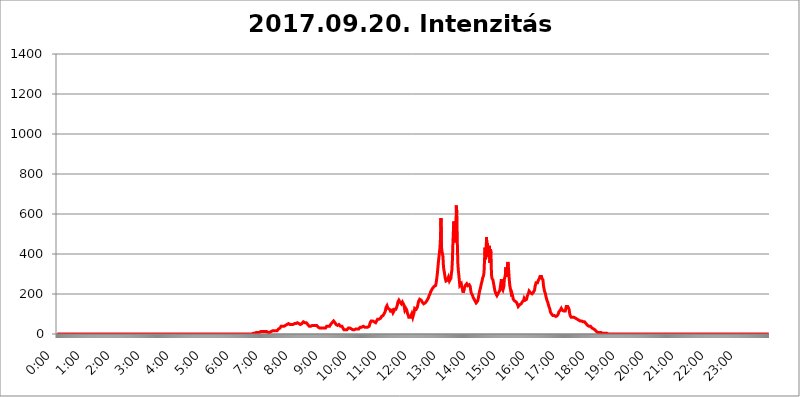
| Category | 2017.09.20. Intenzitás [W/m^2] |
|---|---|
| 0.0 | 0 |
| 0.0006944444444444445 | 0 |
| 0.001388888888888889 | 0 |
| 0.0020833333333333333 | 0 |
| 0.002777777777777778 | 0 |
| 0.003472222222222222 | 0 |
| 0.004166666666666667 | 0 |
| 0.004861111111111111 | 0 |
| 0.005555555555555556 | 0 |
| 0.0062499999999999995 | 0 |
| 0.006944444444444444 | 0 |
| 0.007638888888888889 | 0 |
| 0.008333333333333333 | 0 |
| 0.009027777777777779 | 0 |
| 0.009722222222222222 | 0 |
| 0.010416666666666666 | 0 |
| 0.011111111111111112 | 0 |
| 0.011805555555555555 | 0 |
| 0.012499999999999999 | 0 |
| 0.013194444444444444 | 0 |
| 0.013888888888888888 | 0 |
| 0.014583333333333332 | 0 |
| 0.015277777777777777 | 0 |
| 0.015972222222222224 | 0 |
| 0.016666666666666666 | 0 |
| 0.017361111111111112 | 0 |
| 0.018055555555555557 | 0 |
| 0.01875 | 0 |
| 0.019444444444444445 | 0 |
| 0.02013888888888889 | 0 |
| 0.020833333333333332 | 0 |
| 0.02152777777777778 | 0 |
| 0.022222222222222223 | 0 |
| 0.02291666666666667 | 0 |
| 0.02361111111111111 | 0 |
| 0.024305555555555556 | 0 |
| 0.024999999999999998 | 0 |
| 0.025694444444444447 | 0 |
| 0.02638888888888889 | 0 |
| 0.027083333333333334 | 0 |
| 0.027777777777777776 | 0 |
| 0.02847222222222222 | 0 |
| 0.029166666666666664 | 0 |
| 0.029861111111111113 | 0 |
| 0.030555555555555555 | 0 |
| 0.03125 | 0 |
| 0.03194444444444445 | 0 |
| 0.03263888888888889 | 0 |
| 0.03333333333333333 | 0 |
| 0.034027777777777775 | 0 |
| 0.034722222222222224 | 0 |
| 0.035416666666666666 | 0 |
| 0.036111111111111115 | 0 |
| 0.03680555555555556 | 0 |
| 0.0375 | 0 |
| 0.03819444444444444 | 0 |
| 0.03888888888888889 | 0 |
| 0.03958333333333333 | 0 |
| 0.04027777777777778 | 0 |
| 0.04097222222222222 | 0 |
| 0.041666666666666664 | 0 |
| 0.042361111111111106 | 0 |
| 0.04305555555555556 | 0 |
| 0.043750000000000004 | 0 |
| 0.044444444444444446 | 0 |
| 0.04513888888888889 | 0 |
| 0.04583333333333334 | 0 |
| 0.04652777777777778 | 0 |
| 0.04722222222222222 | 0 |
| 0.04791666666666666 | 0 |
| 0.04861111111111111 | 0 |
| 0.049305555555555554 | 0 |
| 0.049999999999999996 | 0 |
| 0.05069444444444445 | 0 |
| 0.051388888888888894 | 0 |
| 0.052083333333333336 | 0 |
| 0.05277777777777778 | 0 |
| 0.05347222222222222 | 0 |
| 0.05416666666666667 | 0 |
| 0.05486111111111111 | 0 |
| 0.05555555555555555 | 0 |
| 0.05625 | 0 |
| 0.05694444444444444 | 0 |
| 0.057638888888888885 | 0 |
| 0.05833333333333333 | 0 |
| 0.05902777777777778 | 0 |
| 0.059722222222222225 | 0 |
| 0.06041666666666667 | 0 |
| 0.061111111111111116 | 0 |
| 0.06180555555555556 | 0 |
| 0.0625 | 0 |
| 0.06319444444444444 | 0 |
| 0.06388888888888888 | 0 |
| 0.06458333333333334 | 0 |
| 0.06527777777777778 | 0 |
| 0.06597222222222222 | 0 |
| 0.06666666666666667 | 0 |
| 0.06736111111111111 | 0 |
| 0.06805555555555555 | 0 |
| 0.06874999999999999 | 0 |
| 0.06944444444444443 | 0 |
| 0.07013888888888889 | 0 |
| 0.07083333333333333 | 0 |
| 0.07152777777777779 | 0 |
| 0.07222222222222223 | 0 |
| 0.07291666666666667 | 0 |
| 0.07361111111111111 | 0 |
| 0.07430555555555556 | 0 |
| 0.075 | 0 |
| 0.07569444444444444 | 0 |
| 0.0763888888888889 | 0 |
| 0.07708333333333334 | 0 |
| 0.07777777777777778 | 0 |
| 0.07847222222222222 | 0 |
| 0.07916666666666666 | 0 |
| 0.0798611111111111 | 0 |
| 0.08055555555555556 | 0 |
| 0.08125 | 0 |
| 0.08194444444444444 | 0 |
| 0.08263888888888889 | 0 |
| 0.08333333333333333 | 0 |
| 0.08402777777777777 | 0 |
| 0.08472222222222221 | 0 |
| 0.08541666666666665 | 0 |
| 0.08611111111111112 | 0 |
| 0.08680555555555557 | 0 |
| 0.08750000000000001 | 0 |
| 0.08819444444444445 | 0 |
| 0.08888888888888889 | 0 |
| 0.08958333333333333 | 0 |
| 0.09027777777777778 | 0 |
| 0.09097222222222222 | 0 |
| 0.09166666666666667 | 0 |
| 0.09236111111111112 | 0 |
| 0.09305555555555556 | 0 |
| 0.09375 | 0 |
| 0.09444444444444444 | 0 |
| 0.09513888888888888 | 0 |
| 0.09583333333333333 | 0 |
| 0.09652777777777777 | 0 |
| 0.09722222222222222 | 0 |
| 0.09791666666666667 | 0 |
| 0.09861111111111111 | 0 |
| 0.09930555555555555 | 0 |
| 0.09999999999999999 | 0 |
| 0.10069444444444443 | 0 |
| 0.1013888888888889 | 0 |
| 0.10208333333333335 | 0 |
| 0.10277777777777779 | 0 |
| 0.10347222222222223 | 0 |
| 0.10416666666666667 | 0 |
| 0.10486111111111111 | 0 |
| 0.10555555555555556 | 0 |
| 0.10625 | 0 |
| 0.10694444444444444 | 0 |
| 0.1076388888888889 | 0 |
| 0.10833333333333334 | 0 |
| 0.10902777777777778 | 0 |
| 0.10972222222222222 | 0 |
| 0.1111111111111111 | 0 |
| 0.11180555555555556 | 0 |
| 0.11180555555555556 | 0 |
| 0.1125 | 0 |
| 0.11319444444444444 | 0 |
| 0.11388888888888889 | 0 |
| 0.11458333333333333 | 0 |
| 0.11527777777777777 | 0 |
| 0.11597222222222221 | 0 |
| 0.11666666666666665 | 0 |
| 0.1173611111111111 | 0 |
| 0.11805555555555557 | 0 |
| 0.11944444444444445 | 0 |
| 0.12013888888888889 | 0 |
| 0.12083333333333333 | 0 |
| 0.12152777777777778 | 0 |
| 0.12222222222222223 | 0 |
| 0.12291666666666667 | 0 |
| 0.12291666666666667 | 0 |
| 0.12361111111111112 | 0 |
| 0.12430555555555556 | 0 |
| 0.125 | 0 |
| 0.12569444444444444 | 0 |
| 0.12638888888888888 | 0 |
| 0.12708333333333333 | 0 |
| 0.16875 | 0 |
| 0.12847222222222224 | 0 |
| 0.12916666666666668 | 0 |
| 0.12986111111111112 | 0 |
| 0.13055555555555556 | 0 |
| 0.13125 | 0 |
| 0.13194444444444445 | 0 |
| 0.1326388888888889 | 0 |
| 0.13333333333333333 | 0 |
| 0.13402777777777777 | 0 |
| 0.13402777777777777 | 0 |
| 0.13472222222222222 | 0 |
| 0.13541666666666666 | 0 |
| 0.1361111111111111 | 0 |
| 0.13749999999999998 | 0 |
| 0.13819444444444443 | 0 |
| 0.1388888888888889 | 0 |
| 0.13958333333333334 | 0 |
| 0.14027777777777778 | 0 |
| 0.14097222222222222 | 0 |
| 0.14166666666666666 | 0 |
| 0.1423611111111111 | 0 |
| 0.14305555555555557 | 0 |
| 0.14375000000000002 | 0 |
| 0.14444444444444446 | 0 |
| 0.1451388888888889 | 0 |
| 0.1451388888888889 | 0 |
| 0.14652777777777778 | 0 |
| 0.14722222222222223 | 0 |
| 0.14791666666666667 | 0 |
| 0.1486111111111111 | 0 |
| 0.14930555555555555 | 0 |
| 0.15 | 0 |
| 0.15069444444444444 | 0 |
| 0.15138888888888888 | 0 |
| 0.15208333333333332 | 0 |
| 0.15277777777777776 | 0 |
| 0.15347222222222223 | 0 |
| 0.15416666666666667 | 0 |
| 0.15486111111111112 | 0 |
| 0.15555555555555556 | 0 |
| 0.15625 | 0 |
| 0.15694444444444444 | 0 |
| 0.15763888888888888 | 0 |
| 0.15833333333333333 | 0 |
| 0.15902777777777777 | 0 |
| 0.15972222222222224 | 0 |
| 0.16041666666666668 | 0 |
| 0.16111111111111112 | 0 |
| 0.16180555555555556 | 0 |
| 0.1625 | 0 |
| 0.16319444444444445 | 0 |
| 0.1638888888888889 | 0 |
| 0.16458333333333333 | 0 |
| 0.16527777777777777 | 0 |
| 0.16597222222222222 | 0 |
| 0.16666666666666666 | 0 |
| 0.1673611111111111 | 0 |
| 0.16805555555555554 | 0 |
| 0.16874999999999998 | 0 |
| 0.16944444444444443 | 0 |
| 0.17013888888888887 | 0 |
| 0.1708333333333333 | 0 |
| 0.17152777777777775 | 0 |
| 0.17222222222222225 | 0 |
| 0.1729166666666667 | 0 |
| 0.17361111111111113 | 0 |
| 0.17430555555555557 | 0 |
| 0.17500000000000002 | 0 |
| 0.17569444444444446 | 0 |
| 0.1763888888888889 | 0 |
| 0.17708333333333334 | 0 |
| 0.17777777777777778 | 0 |
| 0.17847222222222223 | 0 |
| 0.17916666666666667 | 0 |
| 0.1798611111111111 | 0 |
| 0.18055555555555555 | 0 |
| 0.18125 | 0 |
| 0.18194444444444444 | 0 |
| 0.1826388888888889 | 0 |
| 0.18333333333333335 | 0 |
| 0.1840277777777778 | 0 |
| 0.18472222222222223 | 0 |
| 0.18541666666666667 | 0 |
| 0.18611111111111112 | 0 |
| 0.18680555555555556 | 0 |
| 0.1875 | 0 |
| 0.18819444444444444 | 0 |
| 0.18888888888888888 | 0 |
| 0.18958333333333333 | 0 |
| 0.19027777777777777 | 0 |
| 0.1909722222222222 | 0 |
| 0.19166666666666665 | 0 |
| 0.19236111111111112 | 0 |
| 0.19305555555555554 | 0 |
| 0.19375 | 0 |
| 0.19444444444444445 | 0 |
| 0.1951388888888889 | 0 |
| 0.19583333333333333 | 0 |
| 0.19652777777777777 | 0 |
| 0.19722222222222222 | 0 |
| 0.19791666666666666 | 0 |
| 0.1986111111111111 | 0 |
| 0.19930555555555554 | 0 |
| 0.19999999999999998 | 0 |
| 0.20069444444444443 | 0 |
| 0.20138888888888887 | 0 |
| 0.2020833333333333 | 0 |
| 0.2027777777777778 | 0 |
| 0.2034722222222222 | 0 |
| 0.2041666666666667 | 0 |
| 0.20486111111111113 | 0 |
| 0.20555555555555557 | 0 |
| 0.20625000000000002 | 0 |
| 0.20694444444444446 | 0 |
| 0.2076388888888889 | 0 |
| 0.20833333333333334 | 0 |
| 0.20902777777777778 | 0 |
| 0.20972222222222223 | 0 |
| 0.21041666666666667 | 0 |
| 0.2111111111111111 | 0 |
| 0.21180555555555555 | 0 |
| 0.2125 | 0 |
| 0.21319444444444444 | 0 |
| 0.2138888888888889 | 0 |
| 0.21458333333333335 | 0 |
| 0.2152777777777778 | 0 |
| 0.21597222222222223 | 0 |
| 0.21666666666666667 | 0 |
| 0.21736111111111112 | 0 |
| 0.21805555555555556 | 0 |
| 0.21875 | 0 |
| 0.21944444444444444 | 0 |
| 0.22013888888888888 | 0 |
| 0.22083333333333333 | 0 |
| 0.22152777777777777 | 0 |
| 0.2222222222222222 | 0 |
| 0.22291666666666665 | 0 |
| 0.2236111111111111 | 0 |
| 0.22430555555555556 | 0 |
| 0.225 | 0 |
| 0.22569444444444445 | 0 |
| 0.2263888888888889 | 0 |
| 0.22708333333333333 | 0 |
| 0.22777777777777777 | 0 |
| 0.22847222222222222 | 0 |
| 0.22916666666666666 | 0 |
| 0.2298611111111111 | 0 |
| 0.23055555555555554 | 0 |
| 0.23124999999999998 | 0 |
| 0.23194444444444443 | 0 |
| 0.23263888888888887 | 0 |
| 0.2333333333333333 | 0 |
| 0.2340277777777778 | 0 |
| 0.2347222222222222 | 0 |
| 0.2354166666666667 | 0 |
| 0.23611111111111113 | 0 |
| 0.23680555555555557 | 0 |
| 0.23750000000000002 | 0 |
| 0.23819444444444446 | 0 |
| 0.2388888888888889 | 0 |
| 0.23958333333333334 | 0 |
| 0.24027777777777778 | 0 |
| 0.24097222222222223 | 0 |
| 0.24166666666666667 | 0 |
| 0.2423611111111111 | 0 |
| 0.24305555555555555 | 0 |
| 0.24375 | 0 |
| 0.24444444444444446 | 0 |
| 0.24513888888888888 | 0 |
| 0.24583333333333335 | 0 |
| 0.2465277777777778 | 0 |
| 0.24722222222222223 | 0 |
| 0.24791666666666667 | 0 |
| 0.24861111111111112 | 0 |
| 0.24930555555555556 | 0 |
| 0.25 | 0 |
| 0.25069444444444444 | 0 |
| 0.2513888888888889 | 0 |
| 0.2520833333333333 | 0 |
| 0.25277777777777777 | 0 |
| 0.2534722222222222 | 0 |
| 0.25416666666666665 | 0 |
| 0.2548611111111111 | 0 |
| 0.2555555555555556 | 0 |
| 0.25625000000000003 | 0 |
| 0.2569444444444445 | 0 |
| 0.2576388888888889 | 0 |
| 0.25833333333333336 | 0 |
| 0.2590277777777778 | 0 |
| 0.25972222222222224 | 0 |
| 0.2604166666666667 | 0 |
| 0.2611111111111111 | 0 |
| 0.26180555555555557 | 0 |
| 0.2625 | 0 |
| 0.26319444444444445 | 0 |
| 0.2638888888888889 | 0 |
| 0.26458333333333334 | 0 |
| 0.2652777777777778 | 0 |
| 0.2659722222222222 | 0 |
| 0.26666666666666666 | 0 |
| 0.2673611111111111 | 0 |
| 0.26805555555555555 | 0 |
| 0.26875 | 0 |
| 0.26944444444444443 | 0 |
| 0.2701388888888889 | 0 |
| 0.2708333333333333 | 0 |
| 0.27152777777777776 | 0 |
| 0.2722222222222222 | 0 |
| 0.27291666666666664 | 0 |
| 0.2736111111111111 | 0 |
| 0.2743055555555555 | 3.525 |
| 0.27499999999999997 | 3.525 |
| 0.27569444444444446 | 3.525 |
| 0.27638888888888885 | 3.525 |
| 0.27708333333333335 | 3.525 |
| 0.2777777777777778 | 3.525 |
| 0.27847222222222223 | 3.525 |
| 0.2791666666666667 | 7.887 |
| 0.2798611111111111 | 7.887 |
| 0.28055555555555556 | 7.887 |
| 0.28125 | 7.887 |
| 0.28194444444444444 | 7.887 |
| 0.2826388888888889 | 7.887 |
| 0.2833333333333333 | 7.887 |
| 0.28402777777777777 | 12.257 |
| 0.2847222222222222 | 12.257 |
| 0.28541666666666665 | 12.257 |
| 0.28611111111111115 | 12.257 |
| 0.28680555555555554 | 12.257 |
| 0.28750000000000003 | 12.257 |
| 0.2881944444444445 | 16.636 |
| 0.2888888888888889 | 16.636 |
| 0.28958333333333336 | 12.257 |
| 0.2902777777777778 | 12.257 |
| 0.29097222222222224 | 12.257 |
| 0.2916666666666667 | 12.257 |
| 0.2923611111111111 | 12.257 |
| 0.29305555555555557 | 12.257 |
| 0.29375 | 12.257 |
| 0.29444444444444445 | 7.887 |
| 0.2951388888888889 | 7.887 |
| 0.29583333333333334 | 7.887 |
| 0.2965277777777778 | 7.887 |
| 0.2972222222222222 | 12.257 |
| 0.29791666666666666 | 7.887 |
| 0.2986111111111111 | 12.257 |
| 0.29930555555555555 | 12.257 |
| 0.3 | 12.257 |
| 0.30069444444444443 | 12.257 |
| 0.3013888888888889 | 12.257 |
| 0.3020833333333333 | 16.636 |
| 0.30277777777777776 | 16.636 |
| 0.3034722222222222 | 16.636 |
| 0.30416666666666664 | 16.636 |
| 0.3048611111111111 | 16.636 |
| 0.3055555555555555 | 16.636 |
| 0.30624999999999997 | 16.636 |
| 0.3069444444444444 | 16.636 |
| 0.3076388888888889 | 16.636 |
| 0.30833333333333335 | 16.636 |
| 0.3090277777777778 | 21.024 |
| 0.30972222222222223 | 21.024 |
| 0.3104166666666667 | 25.419 |
| 0.3111111111111111 | 25.419 |
| 0.31180555555555556 | 29.823 |
| 0.3125 | 29.823 |
| 0.31319444444444444 | 34.234 |
| 0.3138888888888889 | 38.653 |
| 0.3145833333333333 | 38.653 |
| 0.31527777777777777 | 38.653 |
| 0.3159722222222222 | 38.653 |
| 0.31666666666666665 | 38.653 |
| 0.31736111111111115 | 38.653 |
| 0.31805555555555554 | 38.653 |
| 0.31875000000000003 | 38.653 |
| 0.3194444444444445 | 38.653 |
| 0.3201388888888889 | 43.079 |
| 0.32083333333333336 | 43.079 |
| 0.3215277777777778 | 47.511 |
| 0.32222222222222224 | 47.511 |
| 0.3229166666666667 | 51.951 |
| 0.3236111111111111 | 51.951 |
| 0.32430555555555557 | 51.951 |
| 0.325 | 51.951 |
| 0.32569444444444445 | 47.511 |
| 0.3263888888888889 | 47.511 |
| 0.32708333333333334 | 47.511 |
| 0.3277777777777778 | 43.079 |
| 0.3284722222222222 | 47.511 |
| 0.32916666666666666 | 47.511 |
| 0.3298611111111111 | 47.511 |
| 0.33055555555555555 | 47.511 |
| 0.33125 | 51.951 |
| 0.33194444444444443 | 51.951 |
| 0.3326388888888889 | 51.951 |
| 0.3333333333333333 | 51.951 |
| 0.3340277777777778 | 51.951 |
| 0.3347222222222222 | 51.951 |
| 0.3354166666666667 | 56.398 |
| 0.3361111111111111 | 56.398 |
| 0.3368055555555556 | 56.398 |
| 0.33749999999999997 | 56.398 |
| 0.33819444444444446 | 56.398 |
| 0.33888888888888885 | 51.951 |
| 0.33958333333333335 | 51.951 |
| 0.34027777777777773 | 47.511 |
| 0.34097222222222223 | 47.511 |
| 0.3416666666666666 | 47.511 |
| 0.3423611111111111 | 47.511 |
| 0.3430555555555555 | 51.951 |
| 0.34375 | 56.398 |
| 0.3444444444444445 | 56.398 |
| 0.3451388888888889 | 60.85 |
| 0.3458333333333334 | 60.85 |
| 0.34652777777777777 | 56.398 |
| 0.34722222222222227 | 56.398 |
| 0.34791666666666665 | 56.398 |
| 0.34861111111111115 | 56.398 |
| 0.34930555555555554 | 56.398 |
| 0.35000000000000003 | 56.398 |
| 0.3506944444444444 | 51.951 |
| 0.3513888888888889 | 47.511 |
| 0.3520833333333333 | 43.079 |
| 0.3527777777777778 | 43.079 |
| 0.3534722222222222 | 38.653 |
| 0.3541666666666667 | 38.653 |
| 0.3548611111111111 | 38.653 |
| 0.35555555555555557 | 38.653 |
| 0.35625 | 38.653 |
| 0.35694444444444445 | 38.653 |
| 0.3576388888888889 | 43.079 |
| 0.35833333333333334 | 43.079 |
| 0.3590277777777778 | 43.079 |
| 0.3597222222222222 | 43.079 |
| 0.36041666666666666 | 43.079 |
| 0.3611111111111111 | 43.079 |
| 0.36180555555555555 | 43.079 |
| 0.3625 | 47.511 |
| 0.36319444444444443 | 43.079 |
| 0.3638888888888889 | 43.079 |
| 0.3645833333333333 | 38.653 |
| 0.3652777777777778 | 38.653 |
| 0.3659722222222222 | 34.234 |
| 0.3666666666666667 | 34.234 |
| 0.3673611111111111 | 29.823 |
| 0.3680555555555556 | 29.823 |
| 0.36874999999999997 | 29.823 |
| 0.36944444444444446 | 29.823 |
| 0.37013888888888885 | 29.823 |
| 0.37083333333333335 | 29.823 |
| 0.37152777777777773 | 29.823 |
| 0.37222222222222223 | 29.823 |
| 0.3729166666666666 | 29.823 |
| 0.3736111111111111 | 29.823 |
| 0.3743055555555555 | 29.823 |
| 0.375 | 29.823 |
| 0.3756944444444445 | 29.823 |
| 0.3763888888888889 | 29.823 |
| 0.3770833333333334 | 34.234 |
| 0.37777777777777777 | 38.653 |
| 0.37847222222222227 | 38.653 |
| 0.37916666666666665 | 38.653 |
| 0.37986111111111115 | 38.653 |
| 0.38055555555555554 | 38.653 |
| 0.38125000000000003 | 38.653 |
| 0.3819444444444444 | 38.653 |
| 0.3826388888888889 | 43.079 |
| 0.3833333333333333 | 47.511 |
| 0.3840277777777778 | 47.511 |
| 0.3847222222222222 | 51.951 |
| 0.3854166666666667 | 56.398 |
| 0.3861111111111111 | 56.398 |
| 0.38680555555555557 | 60.85 |
| 0.3875 | 65.31 |
| 0.38819444444444445 | 65.31 |
| 0.3888888888888889 | 65.31 |
| 0.38958333333333334 | 56.398 |
| 0.3902777777777778 | 51.951 |
| 0.3909722222222222 | 47.511 |
| 0.39166666666666666 | 43.079 |
| 0.3923611111111111 | 43.079 |
| 0.39305555555555555 | 43.079 |
| 0.39375 | 43.079 |
| 0.39444444444444443 | 43.079 |
| 0.3951388888888889 | 47.511 |
| 0.3958333333333333 | 47.511 |
| 0.3965277777777778 | 43.079 |
| 0.3972222222222222 | 38.653 |
| 0.3979166666666667 | 38.653 |
| 0.3986111111111111 | 38.653 |
| 0.3993055555555556 | 38.653 |
| 0.39999999999999997 | 34.234 |
| 0.40069444444444446 | 29.823 |
| 0.40138888888888885 | 25.419 |
| 0.40208333333333335 | 21.024 |
| 0.40277777777777773 | 21.024 |
| 0.40347222222222223 | 21.024 |
| 0.4041666666666666 | 21.024 |
| 0.4048611111111111 | 21.024 |
| 0.4055555555555555 | 21.024 |
| 0.40625 | 21.024 |
| 0.4069444444444445 | 21.024 |
| 0.4076388888888889 | 25.419 |
| 0.4083333333333334 | 29.823 |
| 0.40902777777777777 | 29.823 |
| 0.40972222222222227 | 29.823 |
| 0.41041666666666665 | 29.823 |
| 0.41111111111111115 | 29.823 |
| 0.41180555555555554 | 29.823 |
| 0.41250000000000003 | 25.419 |
| 0.4131944444444444 | 25.419 |
| 0.4138888888888889 | 21.024 |
| 0.4145833333333333 | 21.024 |
| 0.4152777777777778 | 21.024 |
| 0.4159722222222222 | 21.024 |
| 0.4166666666666667 | 21.024 |
| 0.4173611111111111 | 21.024 |
| 0.41805555555555557 | 25.419 |
| 0.41875 | 25.419 |
| 0.41944444444444445 | 29.823 |
| 0.4201388888888889 | 29.823 |
| 0.42083333333333334 | 25.419 |
| 0.4215277777777778 | 25.419 |
| 0.4222222222222222 | 25.419 |
| 0.42291666666666666 | 25.419 |
| 0.4236111111111111 | 29.823 |
| 0.42430555555555555 | 29.823 |
| 0.425 | 34.234 |
| 0.42569444444444443 | 34.234 |
| 0.4263888888888889 | 34.234 |
| 0.4270833333333333 | 34.234 |
| 0.4277777777777778 | 34.234 |
| 0.4284722222222222 | 34.234 |
| 0.4291666666666667 | 38.653 |
| 0.4298611111111111 | 34.234 |
| 0.4305555555555556 | 34.234 |
| 0.43124999999999997 | 34.234 |
| 0.43194444444444446 | 34.234 |
| 0.43263888888888885 | 34.234 |
| 0.43333333333333335 | 34.234 |
| 0.43402777777777773 | 34.234 |
| 0.43472222222222223 | 34.234 |
| 0.4354166666666666 | 34.234 |
| 0.4361111111111111 | 34.234 |
| 0.4368055555555555 | 38.653 |
| 0.4375 | 38.653 |
| 0.4381944444444445 | 47.511 |
| 0.4388888888888889 | 56.398 |
| 0.4395833333333334 | 60.85 |
| 0.44027777777777777 | 65.31 |
| 0.44097222222222227 | 65.31 |
| 0.44166666666666665 | 65.31 |
| 0.44236111111111115 | 65.31 |
| 0.44305555555555554 | 65.31 |
| 0.44375000000000003 | 65.31 |
| 0.4444444444444444 | 60.85 |
| 0.4451388888888889 | 56.398 |
| 0.4458333333333333 | 56.398 |
| 0.4465277777777778 | 56.398 |
| 0.4472222222222222 | 60.85 |
| 0.4479166666666667 | 65.31 |
| 0.4486111111111111 | 69.775 |
| 0.44930555555555557 | 74.246 |
| 0.45 | 74.246 |
| 0.45069444444444445 | 74.246 |
| 0.4513888888888889 | 74.246 |
| 0.45208333333333334 | 74.246 |
| 0.4527777777777778 | 74.246 |
| 0.4534722222222222 | 78.722 |
| 0.45416666666666666 | 83.205 |
| 0.4548611111111111 | 87.692 |
| 0.45555555555555555 | 87.692 |
| 0.45625 | 87.692 |
| 0.45694444444444443 | 92.184 |
| 0.4576388888888889 | 96.682 |
| 0.4583333333333333 | 101.184 |
| 0.4590277777777778 | 105.69 |
| 0.4597222222222222 | 110.201 |
| 0.4604166666666667 | 119.235 |
| 0.4611111111111111 | 132.814 |
| 0.4618055555555556 | 137.347 |
| 0.46249999999999997 | 141.884 |
| 0.46319444444444446 | 137.347 |
| 0.46388888888888885 | 128.284 |
| 0.46458333333333335 | 128.284 |
| 0.46527777777777773 | 128.284 |
| 0.46597222222222223 | 123.758 |
| 0.4666666666666666 | 119.235 |
| 0.4673611111111111 | 114.716 |
| 0.4680555555555555 | 119.235 |
| 0.46875 | 119.235 |
| 0.4694444444444445 | 119.235 |
| 0.4701388888888889 | 114.716 |
| 0.4708333333333334 | 105.69 |
| 0.47152777777777777 | 110.201 |
| 0.47222222222222227 | 114.716 |
| 0.47291666666666665 | 123.758 |
| 0.47361111111111115 | 128.284 |
| 0.47430555555555554 | 128.284 |
| 0.47500000000000003 | 123.758 |
| 0.4756944444444444 | 128.284 |
| 0.4763888888888889 | 137.347 |
| 0.4770833333333333 | 146.423 |
| 0.4777777777777778 | 160.056 |
| 0.4784722222222222 | 164.605 |
| 0.4791666666666667 | 169.156 |
| 0.4798611111111111 | 164.605 |
| 0.48055555555555557 | 160.056 |
| 0.48125 | 155.509 |
| 0.48194444444444445 | 155.509 |
| 0.4826388888888889 | 150.964 |
| 0.48333333333333334 | 155.509 |
| 0.4840277777777778 | 160.056 |
| 0.4847222222222222 | 160.056 |
| 0.48541666666666666 | 155.509 |
| 0.4861111111111111 | 146.423 |
| 0.48680555555555555 | 132.814 |
| 0.4875 | 119.235 |
| 0.48819444444444443 | 119.235 |
| 0.4888888888888889 | 128.284 |
| 0.4895833333333333 | 128.284 |
| 0.4902777777777778 | 119.235 |
| 0.4909722222222222 | 105.69 |
| 0.4916666666666667 | 101.184 |
| 0.4923611111111111 | 92.184 |
| 0.4930555555555556 | 83.205 |
| 0.49374999999999997 | 87.692 |
| 0.49444444444444446 | 87.692 |
| 0.49513888888888885 | 83.205 |
| 0.49583333333333335 | 83.205 |
| 0.49652777777777773 | 87.692 |
| 0.49722222222222223 | 101.184 |
| 0.4979166666666666 | 101.184 |
| 0.4986111111111111 | 83.205 |
| 0.4993055555555555 | 78.722 |
| 0.5 | 87.692 |
| 0.5006944444444444 | 110.201 |
| 0.5013888888888889 | 128.284 |
| 0.5020833333333333 | 128.284 |
| 0.5027777777777778 | 123.758 |
| 0.5034722222222222 | 123.758 |
| 0.5041666666666667 | 128.284 |
| 0.5048611111111111 | 132.814 |
| 0.5055555555555555 | 141.884 |
| 0.50625 | 155.509 |
| 0.5069444444444444 | 164.605 |
| 0.5076388888888889 | 169.156 |
| 0.5083333333333333 | 173.709 |
| 0.5090277777777777 | 173.709 |
| 0.5097222222222222 | 173.709 |
| 0.5104166666666666 | 169.156 |
| 0.5111111111111112 | 164.605 |
| 0.5118055555555555 | 160.056 |
| 0.5125000000000001 | 155.509 |
| 0.5131944444444444 | 155.509 |
| 0.513888888888889 | 150.964 |
| 0.5145833333333333 | 150.964 |
| 0.5152777777777778 | 155.509 |
| 0.5159722222222222 | 155.509 |
| 0.5166666666666667 | 160.056 |
| 0.517361111111111 | 160.056 |
| 0.5180555555555556 | 164.605 |
| 0.5187499999999999 | 164.605 |
| 0.5194444444444445 | 173.709 |
| 0.5201388888888888 | 173.709 |
| 0.5208333333333334 | 182.82 |
| 0.5215277777777778 | 191.937 |
| 0.5222222222222223 | 196.497 |
| 0.5229166666666667 | 201.058 |
| 0.5236111111111111 | 210.182 |
| 0.5243055555555556 | 214.746 |
| 0.525 | 219.309 |
| 0.5256944444444445 | 223.873 |
| 0.5263888888888889 | 228.436 |
| 0.5270833333333333 | 233 |
| 0.5277777777777778 | 233 |
| 0.5284722222222222 | 237.564 |
| 0.5291666666666667 | 237.564 |
| 0.5298611111111111 | 242.127 |
| 0.5305555555555556 | 242.127 |
| 0.53125 | 251.251 |
| 0.5319444444444444 | 269.49 |
| 0.5326388888888889 | 287.709 |
| 0.5333333333333333 | 310.44 |
| 0.5340277777777778 | 337.639 |
| 0.5347222222222222 | 364.728 |
| 0.5354166666666667 | 387.202 |
| 0.5361111111111111 | 409.574 |
| 0.5368055555555555 | 431.833 |
| 0.5375 | 480.356 |
| 0.5381944444444444 | 579.542 |
| 0.5388888888888889 | 431.833 |
| 0.5395833333333333 | 414.035 |
| 0.5402777777777777 | 409.574 |
| 0.5409722222222222 | 387.202 |
| 0.5416666666666666 | 337.639 |
| 0.5423611111111112 | 319.517 |
| 0.5430555555555555 | 305.898 |
| 0.5437500000000001 | 287.709 |
| 0.5444444444444444 | 274.047 |
| 0.545138888888889 | 264.932 |
| 0.5458333333333333 | 260.373 |
| 0.5465277777777778 | 264.932 |
| 0.5472222222222222 | 269.49 |
| 0.5479166666666667 | 274.047 |
| 0.548611111111111 | 283.156 |
| 0.5493055555555556 | 274.047 |
| 0.5499999999999999 | 264.932 |
| 0.5506944444444445 | 260.373 |
| 0.5513888888888888 | 260.373 |
| 0.5520833333333334 | 278.603 |
| 0.5527777777777778 | 301.354 |
| 0.5534722222222223 | 319.517 |
| 0.5541666666666667 | 364.728 |
| 0.5548611111111111 | 445.129 |
| 0.5555555555555556 | 510.885 |
| 0.55625 | 562.53 |
| 0.5569444444444445 | 506.542 |
| 0.5576388888888889 | 458.38 |
| 0.5583333333333333 | 471.582 |
| 0.5590277777777778 | 506.542 |
| 0.5597222222222222 | 642.4 |
| 0.5604166666666667 | 604.864 |
| 0.5611111111111111 | 458.38 |
| 0.5618055555555556 | 355.712 |
| 0.5625 | 319.517 |
| 0.5631944444444444 | 296.808 |
| 0.5638888888888889 | 269.49 |
| 0.5645833333333333 | 242.127 |
| 0.5652777777777778 | 237.564 |
| 0.5659722222222222 | 246.689 |
| 0.5666666666666667 | 251.251 |
| 0.5673611111111111 | 237.564 |
| 0.5680555555555555 | 228.436 |
| 0.56875 | 214.746 |
| 0.5694444444444444 | 205.62 |
| 0.5701388888888889 | 210.182 |
| 0.5708333333333333 | 228.436 |
| 0.5715277777777777 | 233 |
| 0.5722222222222222 | 242.127 |
| 0.5729166666666666 | 242.127 |
| 0.5736111111111112 | 242.127 |
| 0.5743055555555555 | 251.251 |
| 0.5750000000000001 | 246.689 |
| 0.5756944444444444 | 242.127 |
| 0.576388888888889 | 242.127 |
| 0.5770833333333333 | 242.127 |
| 0.5777777777777778 | 246.689 |
| 0.5784722222222222 | 251.251 |
| 0.5791666666666667 | 237.564 |
| 0.579861111111111 | 219.309 |
| 0.5805555555555556 | 205.62 |
| 0.5812499999999999 | 201.058 |
| 0.5819444444444445 | 201.058 |
| 0.5826388888888888 | 191.937 |
| 0.5833333333333334 | 182.82 |
| 0.5840277777777778 | 178.264 |
| 0.5847222222222223 | 173.709 |
| 0.5854166666666667 | 169.156 |
| 0.5861111111111111 | 164.605 |
| 0.5868055555555556 | 160.056 |
| 0.5875 | 155.509 |
| 0.5881944444444445 | 155.509 |
| 0.5888888888888889 | 155.509 |
| 0.5895833333333333 | 164.605 |
| 0.5902777777777778 | 173.709 |
| 0.5909722222222222 | 187.378 |
| 0.5916666666666667 | 201.058 |
| 0.5923611111111111 | 214.746 |
| 0.5930555555555556 | 214.746 |
| 0.59375 | 233 |
| 0.5944444444444444 | 246.689 |
| 0.5951388888888889 | 255.813 |
| 0.5958333333333333 | 264.932 |
| 0.5965277777777778 | 278.603 |
| 0.5972222222222222 | 283.156 |
| 0.5979166666666667 | 292.259 |
| 0.5986111111111111 | 310.44 |
| 0.5993055555555555 | 373.729 |
| 0.6 | 431.833 |
| 0.6006944444444444 | 373.729 |
| 0.6013888888888889 | 396.164 |
| 0.6020833333333333 | 484.735 |
| 0.6027777777777777 | 405.108 |
| 0.6034722222222222 | 453.968 |
| 0.6041666666666666 | 387.202 |
| 0.6048611111111112 | 382.715 |
| 0.6055555555555555 | 409.574 |
| 0.6062500000000001 | 440.702 |
| 0.6069444444444444 | 355.712 |
| 0.607638888888889 | 422.943 |
| 0.6083333333333333 | 405.108 |
| 0.6090277777777778 | 296.808 |
| 0.6097222222222222 | 278.603 |
| 0.6104166666666667 | 278.603 |
| 0.611111111111111 | 269.49 |
| 0.6118055555555556 | 255.813 |
| 0.6124999999999999 | 242.127 |
| 0.6131944444444445 | 228.436 |
| 0.6138888888888888 | 214.746 |
| 0.6145833333333334 | 210.182 |
| 0.6152777777777778 | 201.058 |
| 0.6159722222222223 | 196.497 |
| 0.6166666666666667 | 191.937 |
| 0.6173611111111111 | 191.937 |
| 0.6180555555555556 | 201.058 |
| 0.61875 | 205.62 |
| 0.6194444444444445 | 210.182 |
| 0.6201388888888889 | 214.746 |
| 0.6208333333333333 | 219.309 |
| 0.6215277777777778 | 219.309 |
| 0.6222222222222222 | 219.309 |
| 0.6229166666666667 | 274.047 |
| 0.6236111111111111 | 228.436 |
| 0.6243055555555556 | 228.436 |
| 0.625 | 219.309 |
| 0.6256944444444444 | 223.873 |
| 0.6263888888888889 | 237.564 |
| 0.6270833333333333 | 274.047 |
| 0.6277777777777778 | 283.156 |
| 0.6284722222222222 | 296.808 |
| 0.6291666666666667 | 333.113 |
| 0.6298611111111111 | 287.709 |
| 0.6305555555555555 | 301.354 |
| 0.63125 | 305.898 |
| 0.6319444444444444 | 360.221 |
| 0.6326388888888889 | 342.162 |
| 0.6333333333333333 | 305.898 |
| 0.6340277777777777 | 269.49 |
| 0.6347222222222222 | 242.127 |
| 0.6354166666666666 | 228.436 |
| 0.6361111111111112 | 214.746 |
| 0.6368055555555555 | 201.058 |
| 0.6375000000000001 | 187.378 |
| 0.6381944444444444 | 196.497 |
| 0.638888888888889 | 187.378 |
| 0.6395833333333333 | 173.709 |
| 0.6402777777777778 | 173.709 |
| 0.6409722222222222 | 173.709 |
| 0.6416666666666667 | 164.605 |
| 0.642361111111111 | 169.156 |
| 0.6430555555555556 | 164.605 |
| 0.6437499999999999 | 160.056 |
| 0.6444444444444445 | 155.509 |
| 0.6451388888888888 | 150.964 |
| 0.6458333333333334 | 146.423 |
| 0.6465277777777778 | 137.347 |
| 0.6472222222222223 | 137.347 |
| 0.6479166666666667 | 141.884 |
| 0.6486111111111111 | 146.423 |
| 0.6493055555555556 | 150.964 |
| 0.65 | 150.964 |
| 0.6506944444444445 | 150.964 |
| 0.6513888888888889 | 155.509 |
| 0.6520833333333333 | 160.056 |
| 0.6527777777777778 | 160.056 |
| 0.6534722222222222 | 164.605 |
| 0.6541666666666667 | 169.156 |
| 0.6548611111111111 | 178.264 |
| 0.6555555555555556 | 178.264 |
| 0.65625 | 169.156 |
| 0.6569444444444444 | 164.605 |
| 0.6576388888888889 | 169.156 |
| 0.6583333333333333 | 173.709 |
| 0.6590277777777778 | 187.378 |
| 0.6597222222222222 | 182.82 |
| 0.6604166666666667 | 187.378 |
| 0.6611111111111111 | 205.62 |
| 0.6618055555555555 | 214.746 |
| 0.6625 | 214.746 |
| 0.6631944444444444 | 210.182 |
| 0.6638888888888889 | 205.62 |
| 0.6645833333333333 | 201.058 |
| 0.6652777777777777 | 201.058 |
| 0.6659722222222222 | 201.058 |
| 0.6666666666666666 | 201.058 |
| 0.6673611111111111 | 205.62 |
| 0.6680555555555556 | 210.182 |
| 0.6687500000000001 | 214.746 |
| 0.6694444444444444 | 219.309 |
| 0.6701388888888888 | 237.564 |
| 0.6708333333333334 | 233 |
| 0.6715277777777778 | 255.813 |
| 0.6722222222222222 | 255.813 |
| 0.6729166666666666 | 255.813 |
| 0.6736111111111112 | 255.813 |
| 0.6743055555555556 | 264.932 |
| 0.6749999999999999 | 269.49 |
| 0.6756944444444444 | 274.047 |
| 0.6763888888888889 | 278.603 |
| 0.6770833333333334 | 287.709 |
| 0.6777777777777777 | 287.709 |
| 0.6784722222222223 | 287.709 |
| 0.6791666666666667 | 287.709 |
| 0.6798611111111111 | 278.603 |
| 0.6805555555555555 | 278.603 |
| 0.68125 | 269.49 |
| 0.6819444444444445 | 242.127 |
| 0.6826388888888889 | 228.436 |
| 0.6833333333333332 | 214.746 |
| 0.6840277777777778 | 210.182 |
| 0.6847222222222222 | 201.058 |
| 0.6854166666666667 | 187.378 |
| 0.686111111111111 | 182.82 |
| 0.6868055555555556 | 169.156 |
| 0.6875 | 164.605 |
| 0.6881944444444444 | 155.509 |
| 0.688888888888889 | 146.423 |
| 0.6895833333333333 | 137.347 |
| 0.6902777777777778 | 132.814 |
| 0.6909722222222222 | 123.758 |
| 0.6916666666666668 | 110.201 |
| 0.6923611111111111 | 105.69 |
| 0.6930555555555555 | 101.184 |
| 0.69375 | 96.682 |
| 0.6944444444444445 | 96.682 |
| 0.6951388888888889 | 92.184 |
| 0.6958333333333333 | 92.184 |
| 0.6965277777777777 | 92.184 |
| 0.6972222222222223 | 92.184 |
| 0.6979166666666666 | 87.692 |
| 0.6986111111111111 | 87.692 |
| 0.6993055555555556 | 87.692 |
| 0.7000000000000001 | 87.692 |
| 0.7006944444444444 | 87.692 |
| 0.7013888888888888 | 92.184 |
| 0.7020833333333334 | 96.682 |
| 0.7027777777777778 | 101.184 |
| 0.7034722222222222 | 110.201 |
| 0.7041666666666666 | 110.201 |
| 0.7048611111111112 | 114.716 |
| 0.7055555555555556 | 119.235 |
| 0.7062499999999999 | 123.758 |
| 0.7069444444444444 | 128.284 |
| 0.7076388888888889 | 128.284 |
| 0.7083333333333334 | 119.235 |
| 0.7090277777777777 | 119.235 |
| 0.7097222222222223 | 114.716 |
| 0.7104166666666667 | 114.716 |
| 0.7111111111111111 | 114.716 |
| 0.7118055555555555 | 110.201 |
| 0.7125 | 114.716 |
| 0.7131944444444445 | 119.235 |
| 0.7138888888888889 | 137.347 |
| 0.7145833333333332 | 137.347 |
| 0.7152777777777778 | 137.347 |
| 0.7159722222222222 | 137.347 |
| 0.7166666666666667 | 132.814 |
| 0.717361111111111 | 128.284 |
| 0.7180555555555556 | 119.235 |
| 0.71875 | 101.184 |
| 0.7194444444444444 | 92.184 |
| 0.720138888888889 | 92.184 |
| 0.7208333333333333 | 83.205 |
| 0.7215277777777778 | 83.205 |
| 0.7222222222222222 | 78.722 |
| 0.7229166666666668 | 83.205 |
| 0.7236111111111111 | 83.205 |
| 0.7243055555555555 | 83.205 |
| 0.725 | 83.205 |
| 0.7256944444444445 | 83.205 |
| 0.7263888888888889 | 83.205 |
| 0.7270833333333333 | 78.722 |
| 0.7277777777777777 | 78.722 |
| 0.7284722222222223 | 78.722 |
| 0.7291666666666666 | 74.246 |
| 0.7298611111111111 | 74.246 |
| 0.7305555555555556 | 74.246 |
| 0.7312500000000001 | 69.775 |
| 0.7319444444444444 | 69.775 |
| 0.7326388888888888 | 69.775 |
| 0.7333333333333334 | 65.31 |
| 0.7340277777777778 | 65.31 |
| 0.7347222222222222 | 65.31 |
| 0.7354166666666666 | 65.31 |
| 0.7361111111111112 | 65.31 |
| 0.7368055555555556 | 60.85 |
| 0.7374999999999999 | 60.85 |
| 0.7381944444444444 | 60.85 |
| 0.7388888888888889 | 60.85 |
| 0.7395833333333334 | 60.85 |
| 0.7402777777777777 | 56.398 |
| 0.7409722222222223 | 56.398 |
| 0.7416666666666667 | 51.951 |
| 0.7423611111111111 | 47.511 |
| 0.7430555555555555 | 47.511 |
| 0.74375 | 43.079 |
| 0.7444444444444445 | 43.079 |
| 0.7451388888888889 | 43.079 |
| 0.7458333333333332 | 38.653 |
| 0.7465277777777778 | 38.653 |
| 0.7472222222222222 | 38.653 |
| 0.7479166666666667 | 38.653 |
| 0.748611111111111 | 34.234 |
| 0.7493055555555556 | 34.234 |
| 0.75 | 29.823 |
| 0.7506944444444444 | 29.823 |
| 0.751388888888889 | 29.823 |
| 0.7520833333333333 | 25.419 |
| 0.7527777777777778 | 25.419 |
| 0.7534722222222222 | 21.024 |
| 0.7541666666666668 | 21.024 |
| 0.7548611111111111 | 16.636 |
| 0.7555555555555555 | 16.636 |
| 0.75625 | 12.257 |
| 0.7569444444444445 | 12.257 |
| 0.7576388888888889 | 12.257 |
| 0.7583333333333333 | 7.887 |
| 0.7590277777777777 | 7.887 |
| 0.7597222222222223 | 7.887 |
| 0.7604166666666666 | 7.887 |
| 0.7611111111111111 | 7.887 |
| 0.7618055555555556 | 7.887 |
| 0.7625000000000001 | 7.887 |
| 0.7631944444444444 | 3.525 |
| 0.7638888888888888 | 3.525 |
| 0.7645833333333334 | 3.525 |
| 0.7652777777777778 | 3.525 |
| 0.7659722222222222 | 3.525 |
| 0.7666666666666666 | 3.525 |
| 0.7673611111111112 | 3.525 |
| 0.7680555555555556 | 3.525 |
| 0.7687499999999999 | 3.525 |
| 0.7694444444444444 | 3.525 |
| 0.7701388888888889 | 3.525 |
| 0.7708333333333334 | 3.525 |
| 0.7715277777777777 | 3.525 |
| 0.7722222222222223 | 0 |
| 0.7729166666666667 | 0 |
| 0.7736111111111111 | 0 |
| 0.7743055555555555 | 0 |
| 0.775 | 0 |
| 0.7756944444444445 | 0 |
| 0.7763888888888889 | 0 |
| 0.7770833333333332 | 0 |
| 0.7777777777777778 | 0 |
| 0.7784722222222222 | 0 |
| 0.7791666666666667 | 0 |
| 0.779861111111111 | 0 |
| 0.7805555555555556 | 0 |
| 0.78125 | 0 |
| 0.7819444444444444 | 0 |
| 0.782638888888889 | 0 |
| 0.7833333333333333 | 0 |
| 0.7840277777777778 | 0 |
| 0.7847222222222222 | 0 |
| 0.7854166666666668 | 0 |
| 0.7861111111111111 | 0 |
| 0.7868055555555555 | 0 |
| 0.7875 | 0 |
| 0.7881944444444445 | 0 |
| 0.7888888888888889 | 0 |
| 0.7895833333333333 | 0 |
| 0.7902777777777777 | 0 |
| 0.7909722222222223 | 0 |
| 0.7916666666666666 | 0 |
| 0.7923611111111111 | 0 |
| 0.7930555555555556 | 0 |
| 0.7937500000000001 | 0 |
| 0.7944444444444444 | 0 |
| 0.7951388888888888 | 0 |
| 0.7958333333333334 | 0 |
| 0.7965277777777778 | 0 |
| 0.7972222222222222 | 0 |
| 0.7979166666666666 | 0 |
| 0.7986111111111112 | 0 |
| 0.7993055555555556 | 0 |
| 0.7999999999999999 | 0 |
| 0.8006944444444444 | 0 |
| 0.8013888888888889 | 0 |
| 0.8020833333333334 | 0 |
| 0.8027777777777777 | 0 |
| 0.8034722222222223 | 0 |
| 0.8041666666666667 | 0 |
| 0.8048611111111111 | 0 |
| 0.8055555555555555 | 0 |
| 0.80625 | 0 |
| 0.8069444444444445 | 0 |
| 0.8076388888888889 | 0 |
| 0.8083333333333332 | 0 |
| 0.8090277777777778 | 0 |
| 0.8097222222222222 | 0 |
| 0.8104166666666667 | 0 |
| 0.811111111111111 | 0 |
| 0.8118055555555556 | 0 |
| 0.8125 | 0 |
| 0.8131944444444444 | 0 |
| 0.813888888888889 | 0 |
| 0.8145833333333333 | 0 |
| 0.8152777777777778 | 0 |
| 0.8159722222222222 | 0 |
| 0.8166666666666668 | 0 |
| 0.8173611111111111 | 0 |
| 0.8180555555555555 | 0 |
| 0.81875 | 0 |
| 0.8194444444444445 | 0 |
| 0.8201388888888889 | 0 |
| 0.8208333333333333 | 0 |
| 0.8215277777777777 | 0 |
| 0.8222222222222223 | 0 |
| 0.8229166666666666 | 0 |
| 0.8236111111111111 | 0 |
| 0.8243055555555556 | 0 |
| 0.8250000000000001 | 0 |
| 0.8256944444444444 | 0 |
| 0.8263888888888888 | 0 |
| 0.8270833333333334 | 0 |
| 0.8277777777777778 | 0 |
| 0.8284722222222222 | 0 |
| 0.8291666666666666 | 0 |
| 0.8298611111111112 | 0 |
| 0.8305555555555556 | 0 |
| 0.8312499999999999 | 0 |
| 0.8319444444444444 | 0 |
| 0.8326388888888889 | 0 |
| 0.8333333333333334 | 0 |
| 0.8340277777777777 | 0 |
| 0.8347222222222223 | 0 |
| 0.8354166666666667 | 0 |
| 0.8361111111111111 | 0 |
| 0.8368055555555555 | 0 |
| 0.8375 | 0 |
| 0.8381944444444445 | 0 |
| 0.8388888888888889 | 0 |
| 0.8395833333333332 | 0 |
| 0.8402777777777778 | 0 |
| 0.8409722222222222 | 0 |
| 0.8416666666666667 | 0 |
| 0.842361111111111 | 0 |
| 0.8430555555555556 | 0 |
| 0.84375 | 0 |
| 0.8444444444444444 | 0 |
| 0.845138888888889 | 0 |
| 0.8458333333333333 | 0 |
| 0.8465277777777778 | 0 |
| 0.8472222222222222 | 0 |
| 0.8479166666666668 | 0 |
| 0.8486111111111111 | 0 |
| 0.8493055555555555 | 0 |
| 0.85 | 0 |
| 0.8506944444444445 | 0 |
| 0.8513888888888889 | 0 |
| 0.8520833333333333 | 0 |
| 0.8527777777777777 | 0 |
| 0.8534722222222223 | 0 |
| 0.8541666666666666 | 0 |
| 0.8548611111111111 | 0 |
| 0.8555555555555556 | 0 |
| 0.8562500000000001 | 0 |
| 0.8569444444444444 | 0 |
| 0.8576388888888888 | 0 |
| 0.8583333333333334 | 0 |
| 0.8590277777777778 | 0 |
| 0.8597222222222222 | 0 |
| 0.8604166666666666 | 0 |
| 0.8611111111111112 | 0 |
| 0.8618055555555556 | 0 |
| 0.8624999999999999 | 0 |
| 0.8631944444444444 | 0 |
| 0.8638888888888889 | 0 |
| 0.8645833333333334 | 0 |
| 0.8652777777777777 | 0 |
| 0.8659722222222223 | 0 |
| 0.8666666666666667 | 0 |
| 0.8673611111111111 | 0 |
| 0.8680555555555555 | 0 |
| 0.86875 | 0 |
| 0.8694444444444445 | 0 |
| 0.8701388888888889 | 0 |
| 0.8708333333333332 | 0 |
| 0.8715277777777778 | 0 |
| 0.8722222222222222 | 0 |
| 0.8729166666666667 | 0 |
| 0.873611111111111 | 0 |
| 0.8743055555555556 | 0 |
| 0.875 | 0 |
| 0.8756944444444444 | 0 |
| 0.876388888888889 | 0 |
| 0.8770833333333333 | 0 |
| 0.8777777777777778 | 0 |
| 0.8784722222222222 | 0 |
| 0.8791666666666668 | 0 |
| 0.8798611111111111 | 0 |
| 0.8805555555555555 | 0 |
| 0.88125 | 0 |
| 0.8819444444444445 | 0 |
| 0.8826388888888889 | 0 |
| 0.8833333333333333 | 0 |
| 0.8840277777777777 | 0 |
| 0.8847222222222223 | 0 |
| 0.8854166666666666 | 0 |
| 0.8861111111111111 | 0 |
| 0.8868055555555556 | 0 |
| 0.8875000000000001 | 0 |
| 0.8881944444444444 | 0 |
| 0.8888888888888888 | 0 |
| 0.8895833333333334 | 0 |
| 0.8902777777777778 | 0 |
| 0.8909722222222222 | 0 |
| 0.8916666666666666 | 0 |
| 0.8923611111111112 | 0 |
| 0.8930555555555556 | 0 |
| 0.8937499999999999 | 0 |
| 0.8944444444444444 | 0 |
| 0.8951388888888889 | 0 |
| 0.8958333333333334 | 0 |
| 0.8965277777777777 | 0 |
| 0.8972222222222223 | 0 |
| 0.8979166666666667 | 0 |
| 0.8986111111111111 | 0 |
| 0.8993055555555555 | 0 |
| 0.9 | 0 |
| 0.9006944444444445 | 0 |
| 0.9013888888888889 | 0 |
| 0.9020833333333332 | 0 |
| 0.9027777777777778 | 0 |
| 0.9034722222222222 | 0 |
| 0.9041666666666667 | 0 |
| 0.904861111111111 | 0 |
| 0.9055555555555556 | 0 |
| 0.90625 | 0 |
| 0.9069444444444444 | 0 |
| 0.907638888888889 | 0 |
| 0.9083333333333333 | 0 |
| 0.9090277777777778 | 0 |
| 0.9097222222222222 | 0 |
| 0.9104166666666668 | 0 |
| 0.9111111111111111 | 0 |
| 0.9118055555555555 | 0 |
| 0.9125 | 0 |
| 0.9131944444444445 | 0 |
| 0.9138888888888889 | 0 |
| 0.9145833333333333 | 0 |
| 0.9152777777777777 | 0 |
| 0.9159722222222223 | 0 |
| 0.9166666666666666 | 0 |
| 0.9173611111111111 | 0 |
| 0.9180555555555556 | 0 |
| 0.9187500000000001 | 0 |
| 0.9194444444444444 | 0 |
| 0.9201388888888888 | 0 |
| 0.9208333333333334 | 0 |
| 0.9215277777777778 | 0 |
| 0.9222222222222222 | 0 |
| 0.9229166666666666 | 0 |
| 0.9236111111111112 | 0 |
| 0.9243055555555556 | 0 |
| 0.9249999999999999 | 0 |
| 0.9256944444444444 | 0 |
| 0.9263888888888889 | 0 |
| 0.9270833333333334 | 0 |
| 0.9277777777777777 | 0 |
| 0.9284722222222223 | 0 |
| 0.9291666666666667 | 0 |
| 0.9298611111111111 | 0 |
| 0.9305555555555555 | 0 |
| 0.93125 | 0 |
| 0.9319444444444445 | 0 |
| 0.9326388888888889 | 0 |
| 0.9333333333333332 | 0 |
| 0.9340277777777778 | 0 |
| 0.9347222222222222 | 0 |
| 0.9354166666666667 | 0 |
| 0.936111111111111 | 0 |
| 0.9368055555555556 | 0 |
| 0.9375 | 0 |
| 0.9381944444444444 | 0 |
| 0.938888888888889 | 0 |
| 0.9395833333333333 | 0 |
| 0.9402777777777778 | 0 |
| 0.9409722222222222 | 0 |
| 0.9416666666666668 | 0 |
| 0.9423611111111111 | 0 |
| 0.9430555555555555 | 0 |
| 0.94375 | 0 |
| 0.9444444444444445 | 0 |
| 0.9451388888888889 | 0 |
| 0.9458333333333333 | 0 |
| 0.9465277777777777 | 0 |
| 0.9472222222222223 | 0 |
| 0.9479166666666666 | 0 |
| 0.9486111111111111 | 0 |
| 0.9493055555555556 | 0 |
| 0.9500000000000001 | 0 |
| 0.9506944444444444 | 0 |
| 0.9513888888888888 | 0 |
| 0.9520833333333334 | 0 |
| 0.9527777777777778 | 0 |
| 0.9534722222222222 | 0 |
| 0.9541666666666666 | 0 |
| 0.9548611111111112 | 0 |
| 0.9555555555555556 | 0 |
| 0.9562499999999999 | 0 |
| 0.9569444444444444 | 0 |
| 0.9576388888888889 | 0 |
| 0.9583333333333334 | 0 |
| 0.9590277777777777 | 0 |
| 0.9597222222222223 | 0 |
| 0.9604166666666667 | 0 |
| 0.9611111111111111 | 0 |
| 0.9618055555555555 | 0 |
| 0.9625 | 0 |
| 0.9631944444444445 | 0 |
| 0.9638888888888889 | 0 |
| 0.9645833333333332 | 0 |
| 0.9652777777777778 | 0 |
| 0.9659722222222222 | 0 |
| 0.9666666666666667 | 0 |
| 0.967361111111111 | 0 |
| 0.9680555555555556 | 0 |
| 0.96875 | 0 |
| 0.9694444444444444 | 0 |
| 0.970138888888889 | 0 |
| 0.9708333333333333 | 0 |
| 0.9715277777777778 | 0 |
| 0.9722222222222222 | 0 |
| 0.9729166666666668 | 0 |
| 0.9736111111111111 | 0 |
| 0.9743055555555555 | 0 |
| 0.975 | 0 |
| 0.9756944444444445 | 0 |
| 0.9763888888888889 | 0 |
| 0.9770833333333333 | 0 |
| 0.9777777777777777 | 0 |
| 0.9784722222222223 | 0 |
| 0.9791666666666666 | 0 |
| 0.9798611111111111 | 0 |
| 0.9805555555555556 | 0 |
| 0.9812500000000001 | 0 |
| 0.9819444444444444 | 0 |
| 0.9826388888888888 | 0 |
| 0.9833333333333334 | 0 |
| 0.9840277777777778 | 0 |
| 0.9847222222222222 | 0 |
| 0.9854166666666666 | 0 |
| 0.9861111111111112 | 0 |
| 0.9868055555555556 | 0 |
| 0.9874999999999999 | 0 |
| 0.9881944444444444 | 0 |
| 0.9888888888888889 | 0 |
| 0.9895833333333334 | 0 |
| 0.9902777777777777 | 0 |
| 0.9909722222222223 | 0 |
| 0.9916666666666667 | 0 |
| 0.9923611111111111 | 0 |
| 0.9930555555555555 | 0 |
| 0.99375 | 0 |
| 0.9944444444444445 | 0 |
| 0.9951388888888889 | 0 |
| 0.9958333333333332 | 0 |
| 0.9965277777777778 | 0 |
| 0.9972222222222222 | 0 |
| 0.9979166666666667 | 0 |
| 0.998611111111111 | 0 |
| 0.9993055555555556 | 0 |